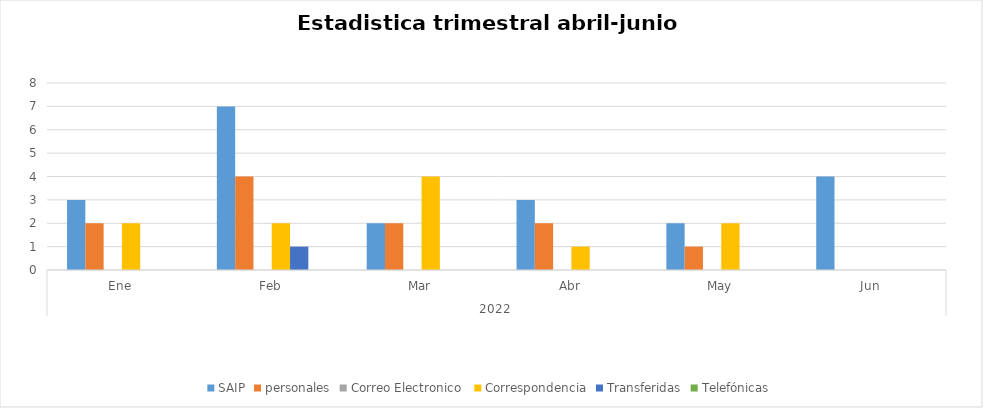
| Category | SAIP | personales | Correo Electronico  | Correspondencia | Transferidas | Telefónicas |
|---|---|---|---|---|---|---|
| 0 | 3 | 2 | 0 | 2 | 0 | 0 |
| 1 | 7 | 4 | 0 | 2 | 1 | 0 |
| 2 | 2 | 2 | 0 | 4 | 0 | 0 |
| 3 | 3 | 2 | 0 | 1 | 0 | 0 |
| 4 | 2 | 1 | 0 | 2 | 0 | 0 |
| 5 | 4 | 0 | 0 | 0 | 0 | 0 |